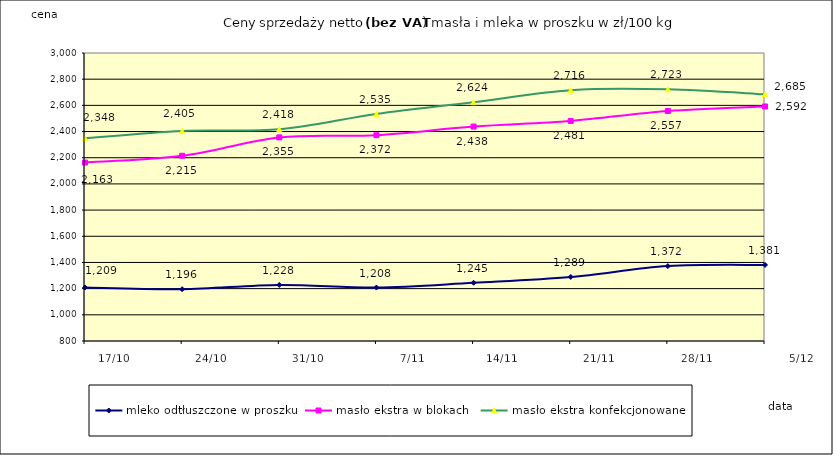
| Category | mleko odtłuszczone w proszku | masło ekstra w blokach  | masło ekstra konfekcjonowane  |
|---|---|---|---|
| 2021-10-17 | 1208.679 | 2162.896 | 2348.068 |
| 2021-10-24 | 1195.719 | 2214.908 | 2404.954 |
| 2021-10-31 | 1228.108 | 2355.326 | 2417.734 |
| 2021-11-07 | 1208.127 | 2372.107 | 2534.755 |
| 2021-11-14 | 1244.849 | 2438.156 | 2624.34 |
| 2021-11-21 | 1289.237 | 2480.888 | 2716.355 |
| 2021-11-28 | 1371.999 | 2557.058 | 2722.795 |
| 2021-12-05 | 1381.129 | 2591.609 | 2684.572 |